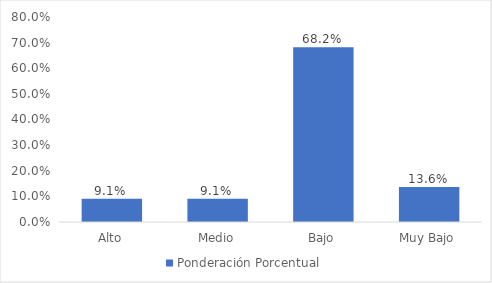
| Category | Ponderación Porcentual |
|---|---|
| Alto | 0.091 |
| Medio | 0.091 |
| Bajo | 0.682 |
| Muy Bajo | 0.136 |